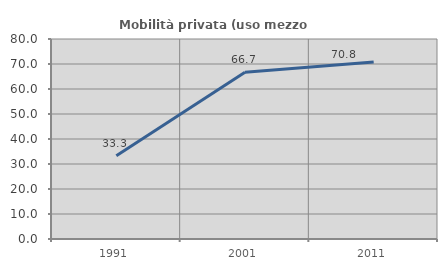
| Category | Mobilità privata (uso mezzo privato) |
|---|---|
| 1991.0 | 33.333 |
| 2001.0 | 66.667 |
| 2011.0 | 70.833 |